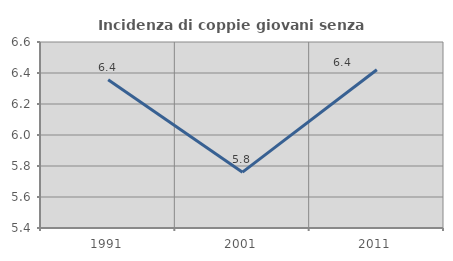
| Category | Incidenza di coppie giovani senza figli |
|---|---|
| 1991.0 | 6.356 |
| 2001.0 | 5.76 |
| 2011.0 | 6.421 |